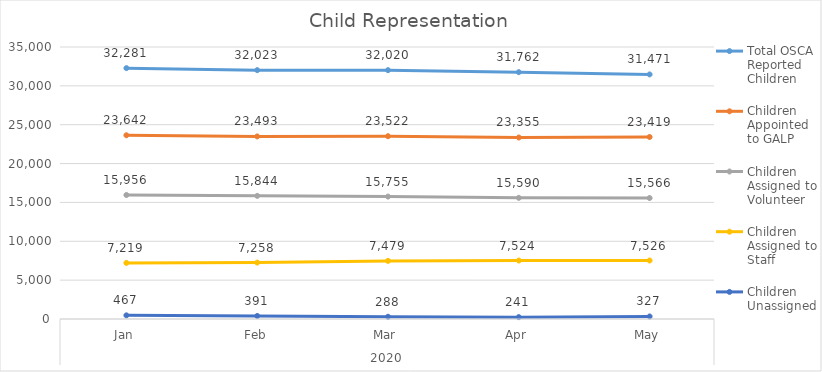
| Category | Total OSCA Reported Children  | Children Appointed to GALP  | Children Assigned to Volunteer  | Children Assigned to Staff  | Children Unassigned  |
|---|---|---|---|---|---|
| 0 | 32281 | 23642 | 15956 | 7219 | 467 |
| 1 | 32023 | 23493 | 15844 | 7258 | 391 |
| 2 | 32020 | 23522 | 15755 | 7479 | 288 |
| 3 | 31762 | 23355 | 15590 | 7524 | 241 |
| 4 | 31471 | 23419 | 15566 | 7526 | 327 |